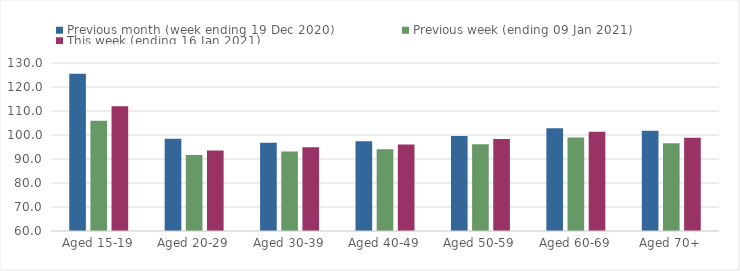
| Category | Previous month (week ending 19 Dec 2020) | Previous week (ending 09 Jan 2021) | This week (ending 16 Jan 2021) |
|---|---|---|---|
| Aged 15-19 | 125.48 | 105.97 | 112.02 |
| Aged 20-29 | 98.41 | 91.69 | 93.49 |
| Aged 30-39 | 96.78 | 93.14 | 94.91 |
| Aged 40-49 | 97.44 | 94.08 | 96.04 |
| Aged 50-59 | 99.6 | 96.18 | 98.34 |
| Aged 60-69 | 102.84 | 99.01 | 101.36 |
| Aged 70+ | 101.75 | 96.53 | 98.81 |